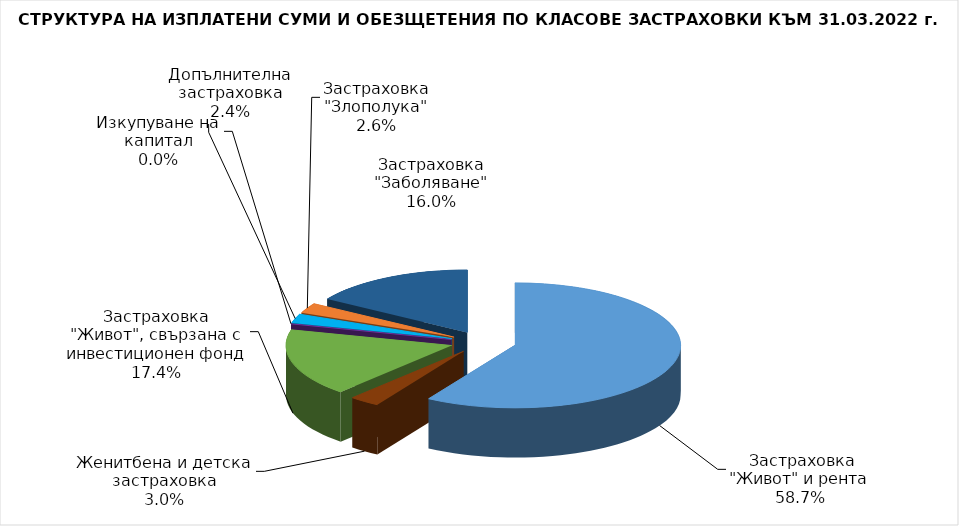
| Category |  Застраховка "Живот" и рента |
|---|---|
|  Застраховка "Живот" и рента | 40688319.14 |
| Женитбена и детска застраховка | 2063868.103 |
| Застраховка "Живот", свързана с инвестиционен фонд | 12027469.917 |
| Изкупуване на капитал | 0 |
| Допълнителна застраховка | 1633830.128 |
| Застраховка "Злополука" | 1782384.695 |
| Застраховка "Заболяване" | 11108839.268 |